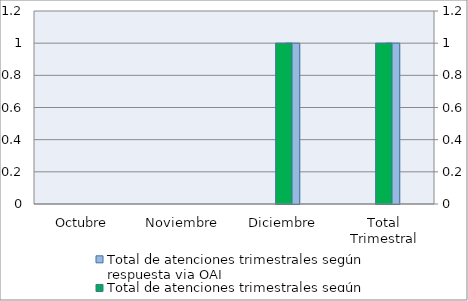
| Category | Total de atenciones trimestrales según respuesta via OAI | Series 2 | Series 4 |
|---|---|---|---|
| Octubre | 0 |  |  |
| Noviembre | 0 |  |  |
| Diciembre | 1 |  |  |
| Total Trimestral | 1 |  |  |